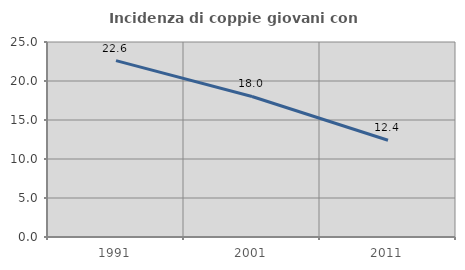
| Category | Incidenza di coppie giovani con figli |
|---|---|
| 1991.0 | 22.612 |
| 2001.0 | 18.015 |
| 2011.0 | 12.398 |